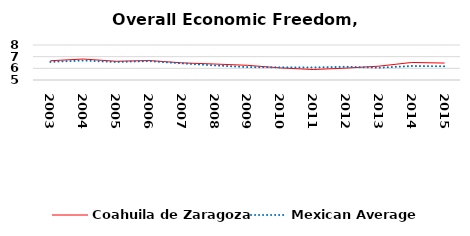
| Category | Coahuila de Zaragoza | Mexican Average  |
|---|---|---|
| 2003.0 | 6.651 | 6.552 |
| 2004.0 | 6.798 | 6.668 |
| 2005.0 | 6.605 | 6.546 |
| 2006.0 | 6.669 | 6.619 |
| 2007.0 | 6.47 | 6.428 |
| 2008.0 | 6.37 | 6.248 |
| 2009.0 | 6.258 | 6.106 |
| 2010.0 | 6.036 | 6.086 |
| 2011.0 | 5.898 | 6.074 |
| 2012.0 | 6.02 | 6.134 |
| 2013.0 | 6.186 | 6.054 |
| 2014.0 | 6.503 | 6.2 |
| 2015.0 | 6.452 | 6.174 |